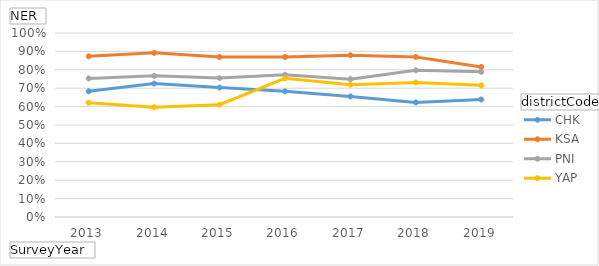
| Category | CHK | KSA | PNI | YAP |
|---|---|---|---|---|
| 2013 | 0.683 | 0.873 | 0.753 | 0.622 |
| 2014 | 0.725 | 0.892 | 0.767 | 0.597 |
| 2015 | 0.704 | 0.869 | 0.755 | 0.61 |
| 2016 | 0.683 | 0.869 | 0.773 | 0.754 |
| 2017 | 0.655 | 0.879 | 0.749 | 0.719 |
| 2018 | 0.623 | 0.87 | 0.797 | 0.732 |
| 2019 | 0.639 | 0.816 | 0.789 | 0.715 |